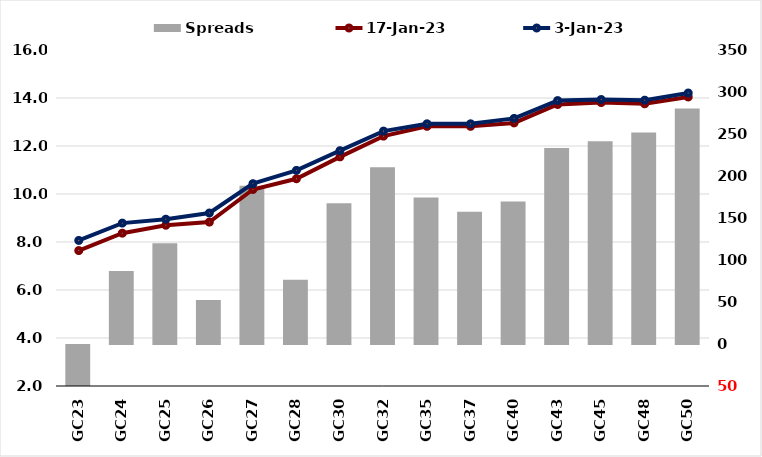
| Category |  Spreads   |
|---|---|
| GC23 | -129.27 |
| GC24 | 86.795 |
| GC25 | 119.794 |
| GC26 | 52.462 |
| GC27 | 188.293 |
| GC28 | 76.488 |
| GC30 | 167.69 |
| GC32 | 210.548 |
| GC35 | 174.35 |
| GC37 | 157.35 |
| GC40 | 169.675 |
| GC43 | 233.343 |
| GC45 | 241.444 |
| GC48 | 251.841 |
| GC50 | 280.242 |